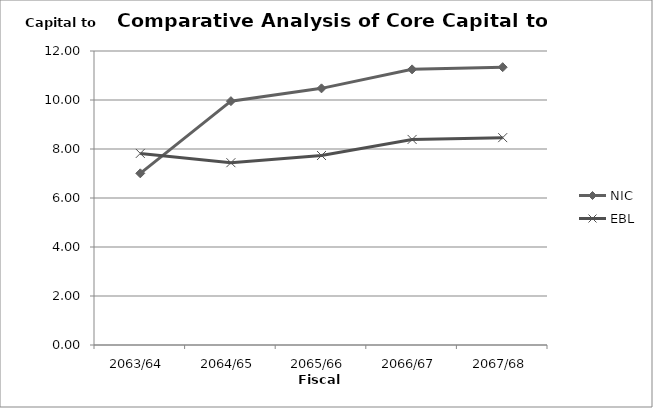
| Category | NIC | EBL |
|---|---|---|
| 2063/64 | 7.007 | 7.82 |
| 2064/65 | 9.953 | 7.442 |
| 2065/66 | 10.475 | 7.735 |
| 2066/67 | 11.25 | 8.39 |
| 2067/68 | 11.339 | 8.464 |